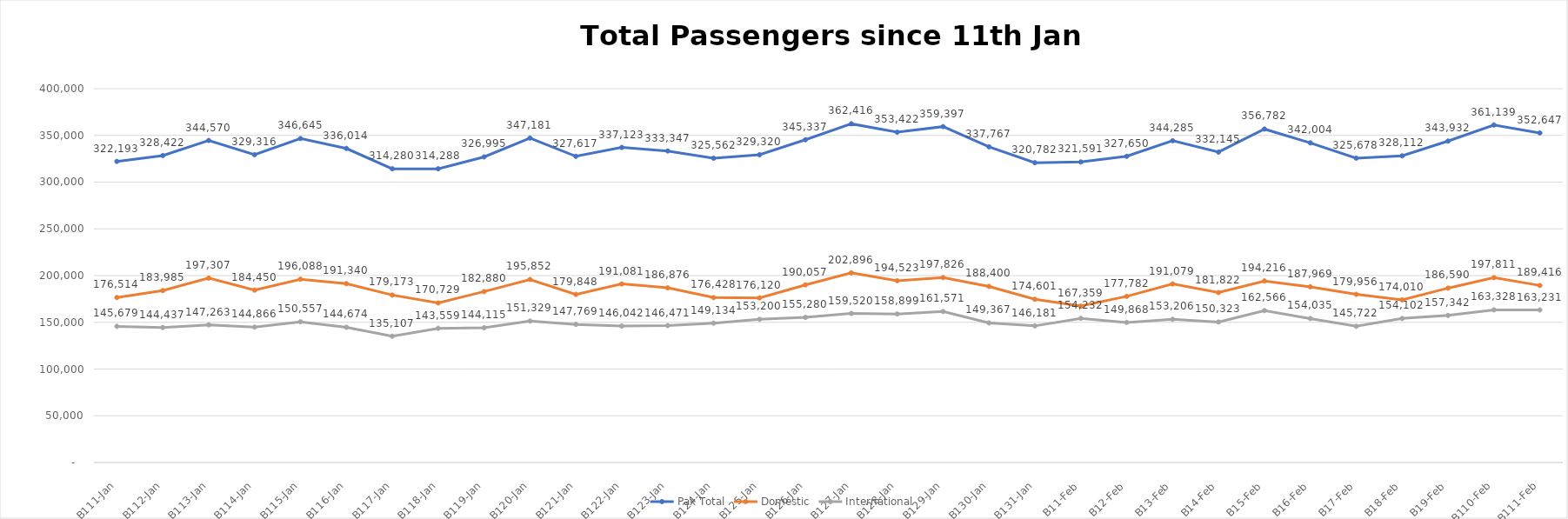
| Category | Pax Total |  Domestic  |  International  |
|---|---|---|---|
| 2023-01-11 | 322193 | 176514 | 145679 |
| 2023-01-12 | 328422 | 183985 | 144437 |
| 2023-01-13 | 344570 | 197307 | 147263 |
| 2023-01-14 | 329316 | 184450 | 144866 |
| 2023-01-15 | 346645 | 196088 | 150557 |
| 2023-01-16 | 336014 | 191340 | 144674 |
| 2023-01-17 | 314280 | 179173 | 135107 |
| 2023-01-18 | 314288 | 170729 | 143559 |
| 2023-01-19 | 326995 | 182880 | 144115 |
| 2023-01-20 | 347181 | 195852 | 151329 |
| 2023-01-21 | 327617 | 179848 | 147769 |
| 2023-01-22 | 337123 | 191081 | 146042 |
| 2023-01-23 | 333347 | 186876 | 146471 |
| 2023-01-24 | 325562 | 176428 | 149134 |
| 2023-01-25 | 329320 | 176120 | 153200 |
| 2023-01-26 | 345337 | 190057 | 155280 |
| 2023-01-27 | 362416 | 202896 | 159520 |
| 2023-01-28 | 353422 | 194523 | 158899 |
| 2023-01-29 | 359397 | 197826 | 161571 |
| 2023-01-30 | 337767 | 188400 | 149367 |
| 2023-01-31 | 320782 | 174601 | 146181 |
| 2023-02-01 | 321591 | 167359 | 154232 |
| 2023-02-02 | 327650 | 177782 | 149868 |
| 2023-02-03 | 344285 | 191079 | 153206 |
| 2023-02-04 | 332145 | 181822 | 150323 |
| 2023-02-05 | 356782 | 194216 | 162566 |
| 2023-02-06 | 342004 | 187969 | 154035 |
| 2023-02-07 | 325678 | 179956 | 145722 |
| 2023-02-08 | 328112 | 174010 | 154102 |
| 2023-02-09 | 343932 | 186590 | 157342 |
| 2023-02-10 | 361139 | 197811 | 163328 |
| 2023-02-11 | 352647 | 189416 | 163231 |